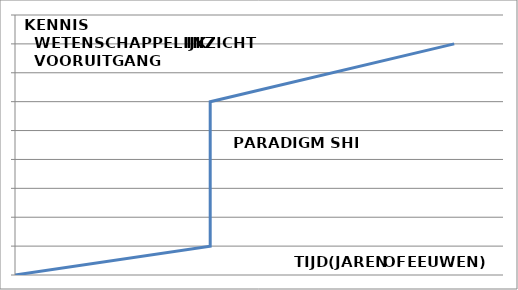
| Category | Series 0 |
|---|---|
| 0.0 | 0 |
| 4.0 | 1 |
| 4.0 | 6 |
| 4.0 | 6 |
| 4.0 | 6 |
| 9.0 | 8 |